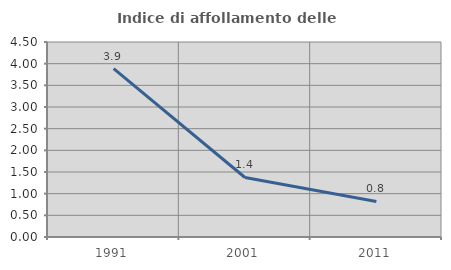
| Category | Indice di affollamento delle abitazioni  |
|---|---|
| 1991.0 | 3.886 |
| 2001.0 | 1.374 |
| 2011.0 | 0.82 |